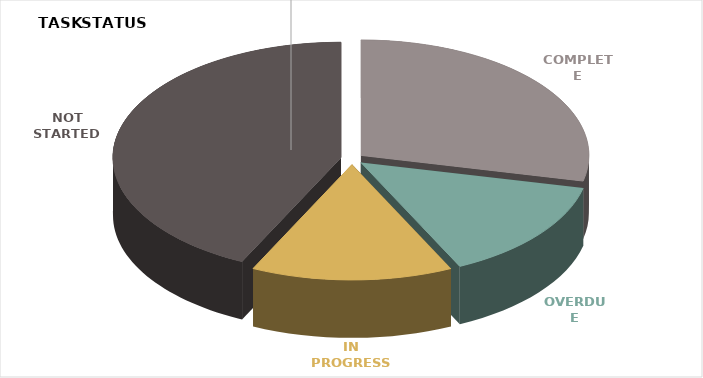
| Category | AMOUNT | % |
|---|---|---|
| COMPLETE | 4 | 0.286 |
| OVERDUE | 2 | 0.143 |
| IN PROGRESS | 2 | 0.143 |
| NOT STARTED | 6 | 0.429 |